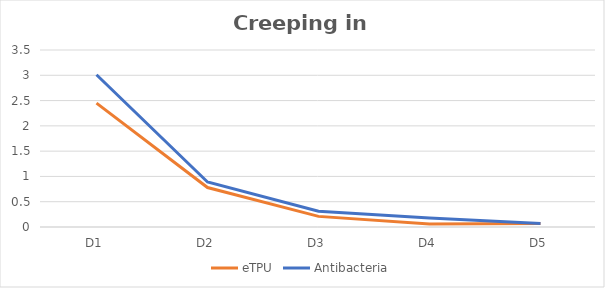
| Category | eTPU | Antibacteria |
|---|---|---|
| D1 | 2.45 | 3.01 |
| D2 | 0.78 | 0.89 |
| D3 | 0.21 | 0.31 |
| D4 | 0.06 | 0.18 |
| D5 | 0.07 | 0.07 |